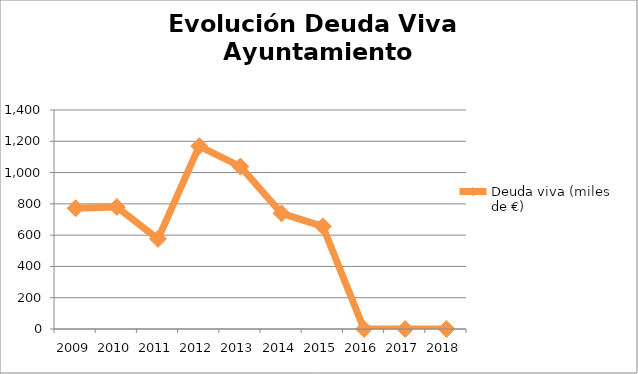
| Category | Deuda viva (miles de €) |
|---|---|
| 2009.0 | 772 |
| 2010.0 | 780 |
| 2011.0 | 576 |
| 2012.0 | 1169 |
| 2013.0 | 1039 |
| 2014.0 | 739 |
| 2015.0 | 656 |
| 2016.0 | 0 |
| 2017.0 | 0 |
| 2018.0 | 0 |